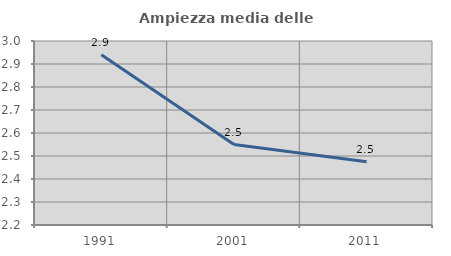
| Category | Ampiezza media delle famiglie |
|---|---|
| 1991.0 | 2.94 |
| 2001.0 | 2.55 |
| 2011.0 | 2.475 |